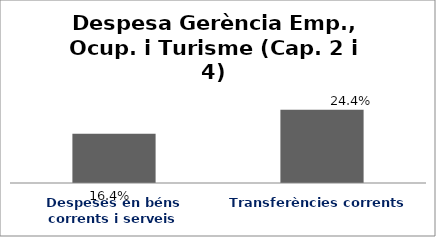
| Category | Series 0 |
|---|---|
| Despeses en béns corrents i serveis | 0.164 |
| Transferències corrents | 0.244 |